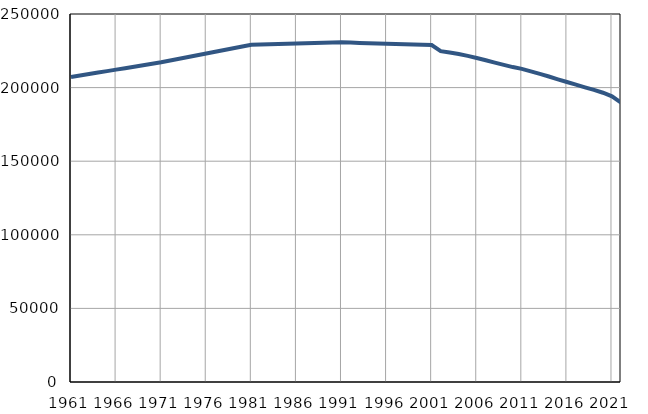
| Category | Population
size |
|---|---|
| 1961.0 | 207195 |
| 1962.0 | 208198 |
| 1963.0 | 209201 |
| 1964.0 | 210203 |
| 1965.0 | 211206 |
| 1966.0 | 212209 |
| 1967.0 | 213212 |
| 1968.0 | 214215 |
| 1969.0 | 215217 |
| 1970.0 | 216220 |
| 1971.0 | 217223 |
| 1972.0 | 218405 |
| 1973.0 | 219588 |
| 1974.0 | 220770 |
| 1975.0 | 221953 |
| 1976.0 | 223135 |
| 1977.0 | 224317 |
| 1978.0 | 225500 |
| 1979.0 | 226682 |
| 1980.0 | 227865 |
| 1981.0 | 229047 |
| 1982.0 | 229217 |
| 1983.0 | 229387 |
| 1984.0 | 229557 |
| 1985.0 | 229727 |
| 1986.0 | 229898 |
| 1987.0 | 230068 |
| 1988.0 | 230238 |
| 1989.0 | 230408 |
| 1990.0 | 230578 |
| 1991.0 | 230748 |
| 1992.0 | 230561 |
| 1993.0 | 230374 |
| 1994.0 | 230186 |
| 1995.0 | 229999 |
| 1996.0 | 229812 |
| 1997.0 | 229625 |
| 1998.0 | 229438 |
| 1999.0 | 229251 |
| 2000.0 | 229063 |
| 2001.0 | 228876 |
| 2002.0 | 224746 |
| 2003.0 | 223862 |
| 2004.0 | 222845 |
| 2005.0 | 221523 |
| 2006.0 | 220094 |
| 2007.0 | 218612 |
| 2008.0 | 216977 |
| 2009.0 | 215422 |
| 2010.0 | 213939 |
| 2011.0 | 212752 |
| 2012.0 | 211042 |
| 2013.0 | 209365 |
| 2014.0 | 207568 |
| 2015.0 | 205631 |
| 2016.0 | 203799 |
| 2017.0 | 202026 |
| 2018.0 | 200205 |
| 2019.0 | 198490 |
| 2020.0 | 196516 |
| 2021.0 | 194072 |
| 2022.0 | 189892 |